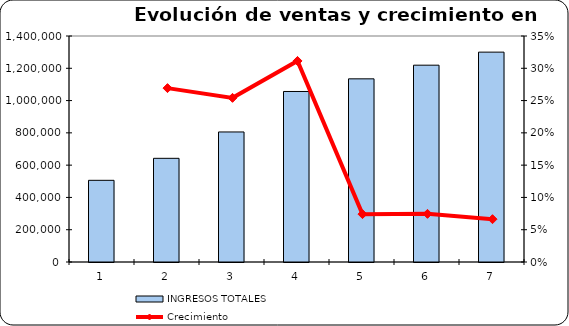
| Category | INGRESOS TOTALES |
|---|---|
| 1.0 | 506000 |
| 2.0 | 642259.875 |
| 3.0 | 805522.54 |
| 4.0 | 1056336.379 |
| 5.0 | 1134633.567 |
| 6.0 | 1219228.777 |
| 7.0 | 1300081.603 |